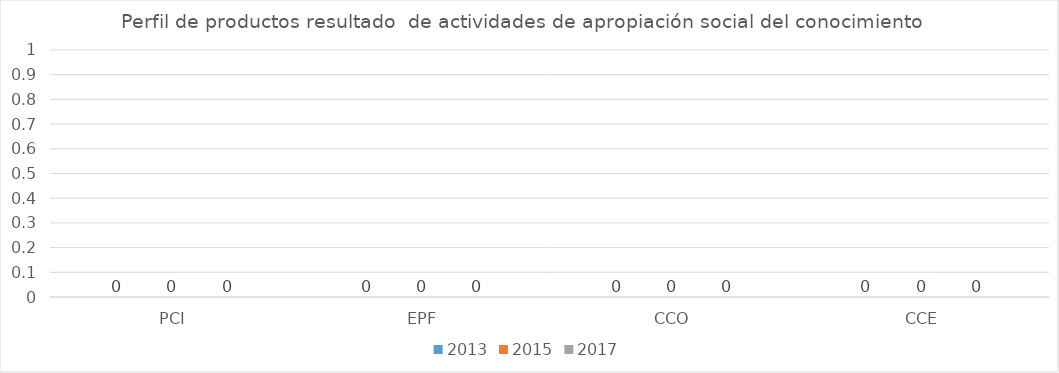
| Category | 2013 | 2015 | 2017 |
|---|---|---|---|
| PCI | 0 | 0 | 0 |
| EPF | 0 | 0 | 0 |
| CCO | 0 | 0 | 0 |
| CCE | 0 | 0 | 0 |